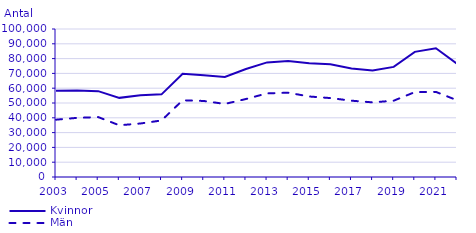
| Category | Kvinnor | Män |
|---|---|---|
| 2003.0 | 58330 | 38727 |
| 2004.0 | 58434 | 39957 |
| 2005.0 | 58019 | 40481 |
| 2006.0 | 53471 | 34944 |
| 2007.0 | 55277 | 36155 |
| 2008.0 | 55847 | 38199 |
| 2009.0 | 69814 | 51848 |
| 2010.0 | 68674 | 51375 |
| 2011.0 | 67596 | 49376 |
| 2012.0 | 72998 | 52689 |
| 2013.0 | 77428 | 56510 |
| 2014.0 | 78294 | 56964 |
| 2015.0 | 76874 | 54394 |
| 2016.0 | 76183 | 53326 |
| 2017.0 | 73362 | 51564 |
| 2018.0 | 71948 | 50424 |
| 2019.0 | 74383 | 51558 |
| 2020.0 | 84567 | 57357 |
| 2021.0 | 86992 | 57509 |
| 2022.0 | 76504 | 51868 |